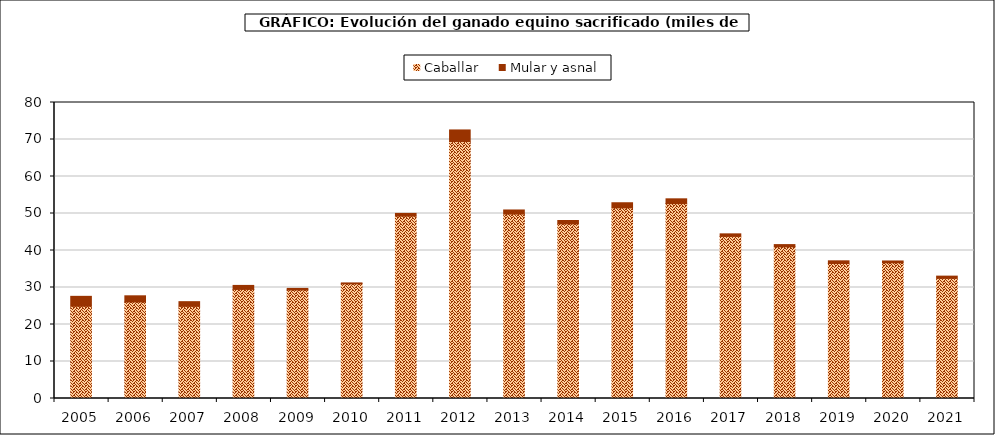
| Category | Caballar | Mular y asnal |
|---|---|---|
| 2005.0 | 24.929 | 2.681 |
| 2006.0 | 26.083 | 1.673 |
| 2007.0 | 24.904 | 1.267 |
| 2008.0 | 29.488 | 1.075 |
| 2009.0 | 29.317 | 0.44 |
| 2010.0 | 30.985 | 0.252 |
| 2011.0 | 49.28 | 0.744 |
| 2012.0 | 69.446 | 3.136 |
| 2013.0 | 49.841 | 1.113 |
| 2014.0 | 47.193 | 0.922 |
| 2015.0 | 51.517 | 1.391 |
| 2016.0 | 52.671 | 1.297 |
| 2017.0 | 43.813 | 0.688 |
| 2018.0 | 40.986 | 0.611 |
| 2019.0 | 36.484 | 0.727 |
| 2020.0 | 36.671 | 0.498 |
| 2021.0 | 32.464 | 0.609 |